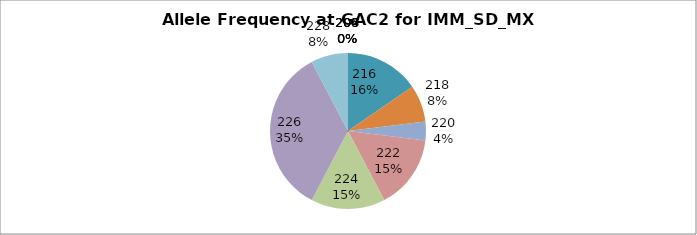
| Category | Series 0 |
|---|---|
| 204.0 | 0 |
| 205.0 | 0 |
| 206.0 | 0 |
| 209.0 | 0 |
| 216.0 | 0.154 |
| 218.0 | 0.077 |
| 220.0 | 0.038 |
| 222.0 | 0.154 |
| 224.0 | 0.154 |
| 226.0 | 0.346 |
| 228.0 | 0.077 |